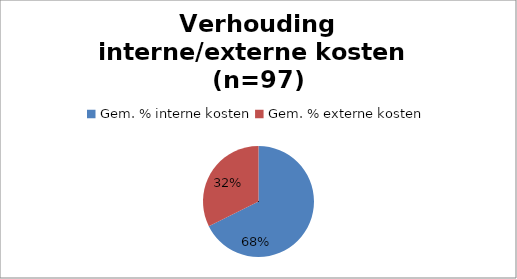
| Category | Series 0 |
|---|---|
| Gem. % interne kosten | 66.948 |
| Gem. % externe kosten | 32.021 |